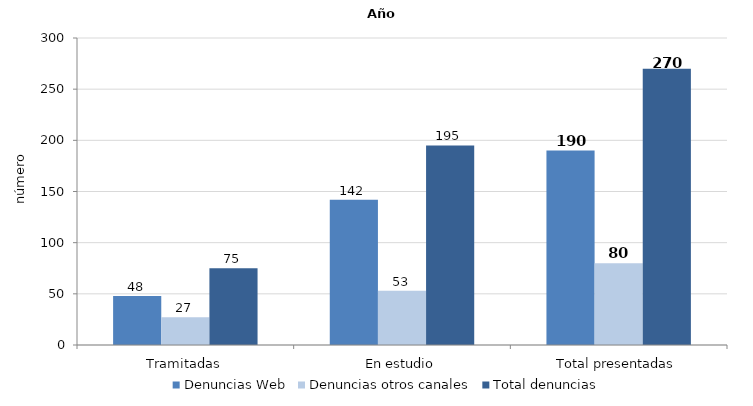
| Category | Denuncias Web | Denuncias otros canales | Total denuncias |
|---|---|---|---|
| Tramitadas | 48 | 27 | 75 |
| En estudio | 142 | 53 | 195 |
| Total presentadas | 190 | 80 | 270 |